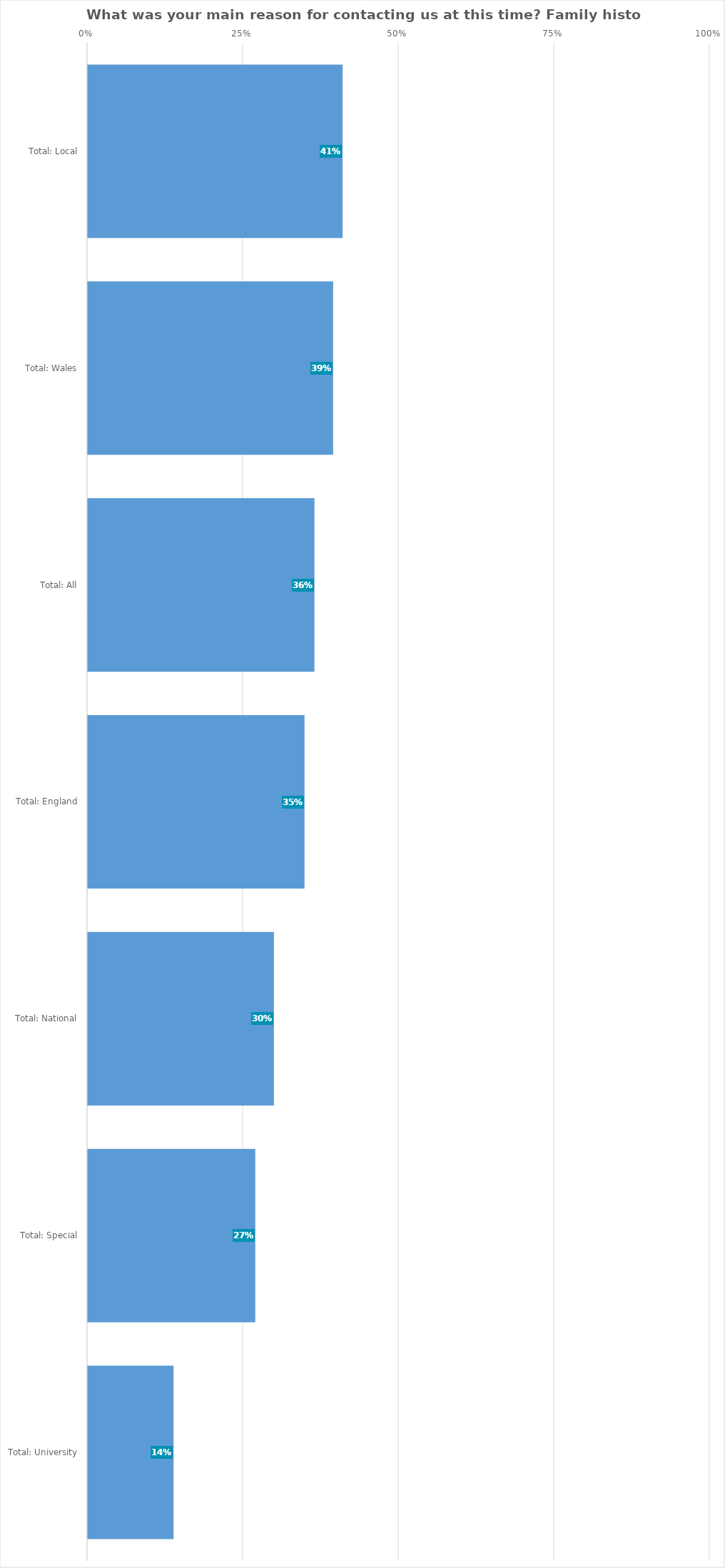
| Category | Family history research |
|---|---|
| Total: Local | 0.41 |
| Total: Wales | 0.394 |
| Total: All | 0.364 |
| Total: England | 0.348 |
| Total: National | 0.299 |
| Total: Special | 0.269 |
| Total: University | 0.138 |